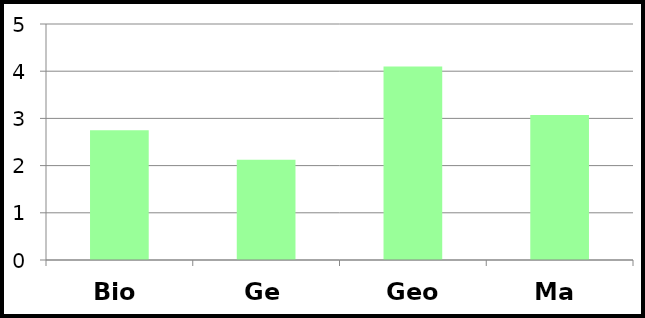
| Category | Series 0 |
|---|---|
| Bio | 2.75 |
| Ge | 2.125 |
| Geo | 4.1 |
| Ma | 3.071 |